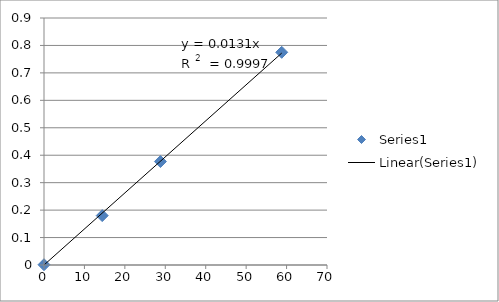
| Category | Series 0 |
|---|---|
| 0.0 | 0.001 |
| 14.4 | 0.18 |
| 28.8 | 0.377 |
| 58.8 | 0.775 |